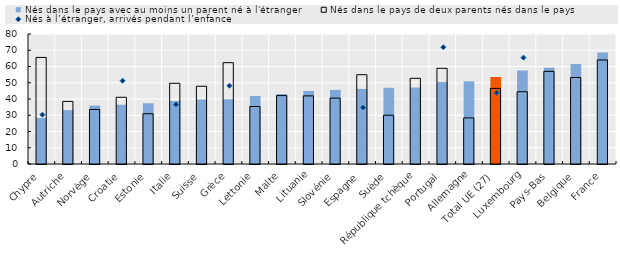
| Category | Nés dans le pays avec au moins un parent né à l'étranger | Nés dans le pays de deux parents nés dans le pays |
|---|---|---|
| Chypre | 28.262 | 65.582 |
| Autriche | 33.153 | 38.5 |
| Norvège | 35.952 | 33.57 |
| Croatie | 36.472 | 41.052 |
| Estonie | 37.365 | 30.942 |
| Italie | 38.757 | 49.677 |
| Suisse | 39.709 | 47.851 |
| Grèce | 39.848 | 62.364 |
| Lettonie | 41.891 | 35.385 |
| Malte | 43.061 | 42.083 |
| Lituanie | 44.958 | 41.912 |
| Slovénie | 45.594 | 40.538 |
| Espagne | 46.229 | 54.945 |
| Suède | 46.888 | 30.016 |
| République tchèque | 47.069 | 52.727 |
| Portugal | 50.419 | 58.899 |
| Allemagne | 50.879 | 28.353 |
| Total UE (27) | 53.526 | 46.52 |
| Luxembourg | 57.56 | 44.475 |
| Pays-Bas | 59.19 | 57.014 |
| Belgique | 61.541 | 53.212 |
| France | 68.667 | 64.019 |